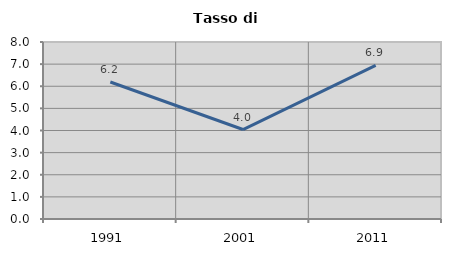
| Category | Tasso di disoccupazione   |
|---|---|
| 1991.0 | 6.191 |
| 2001.0 | 4.044 |
| 2011.0 | 6.943 |